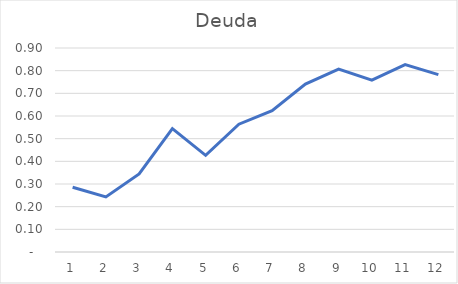
| Category | Series 0 |
|---|---|
| 0 | 0.286 |
| 1 | 0.243 |
| 2 | 0.344 |
| 3 | 0.544 |
| 4 | 0.426 |
| 5 | 0.564 |
| 6 | 0.624 |
| 7 | 0.741 |
| 8 | 0.807 |
| 9 | 0.758 |
| 10 | 0.827 |
| 11 | 0.783 |